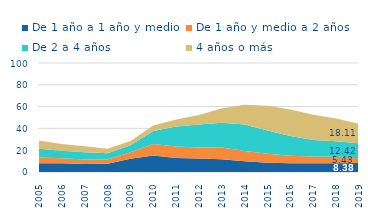
| Category | De 1 año a 1 año y medio | De 1 año y medio a 2 años | De 2 a 4 años | 4 años o más |
|---|---|---|---|---|
| 2005.0 | 8.124 | 5.149 | 8.032 | 7.516 |
| 2006.0 | 7.933 | 4.727 | 6.909 | 6.029 |
| 2007.0 | 7.288 | 4.176 | 6.767 | 5.483 |
| 2008.0 | 7.594 | 3.951 | 5.716 | 4.182 |
| 2009.0 | 12.18 | 5.916 | 6.536 | 3.92 |
| 2010.0 | 15.114 | 10.473 | 12.063 | 4.913 |
| 2011.0 | 12.794 | 10.696 | 18.315 | 6.369 |
| 2012.0 | 12.286 | 10.154 | 21.047 | 8.877 |
| 2013.0 | 11.749 | 10.615 | 22.74 | 13.301 |
| 2014.0 | 9.773 | 9.519 | 24.226 | 18.26 |
| 2015.0 | 8.483 | 8.213 | 21.4 | 22.745 |
| 2016.0 | 8.111 | 6.754 | 18.26 | 24.14 |
| 2017.0 | 7.934 | 6.24 | 15.21 | 23.207 |
| 2018.0 | 8.094 | 5.987 | 14.039 | 20.902 |
| 2019.0 | 8.377 | 5.427 | 12.417 | 18.107 |